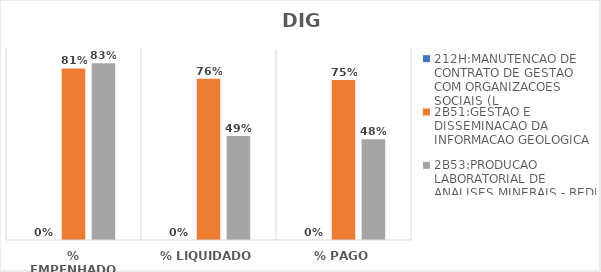
| Category | 212H:MANUTENCAO DE CONTRATO DE GESTAO COM ORGANIZACOES SOCIAIS (L | 2B51:GESTAO E DISSEMINACAO DA INFORMACAO GEOLOGICA | 2B53:PRODUCAO LABORATORIAL DE ANALISES MINERAIS - REDE LAMIN |
|---|---|---|---|
| % EMPENHADO | 0 | 0.809 | 0.833 |
| % LIQUIDADO | 0 | 0.76 | 0.49 |
| % PAGO | 0 | 0.754 | 0.475 |